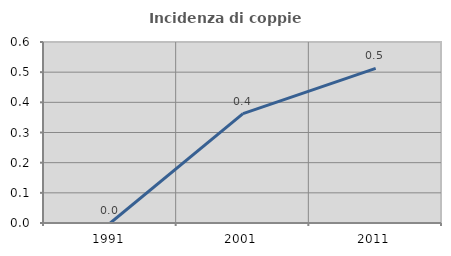
| Category | Incidenza di coppie miste |
|---|---|
| 1991.0 | 0 |
| 2001.0 | 0.363 |
| 2011.0 | 0.513 |